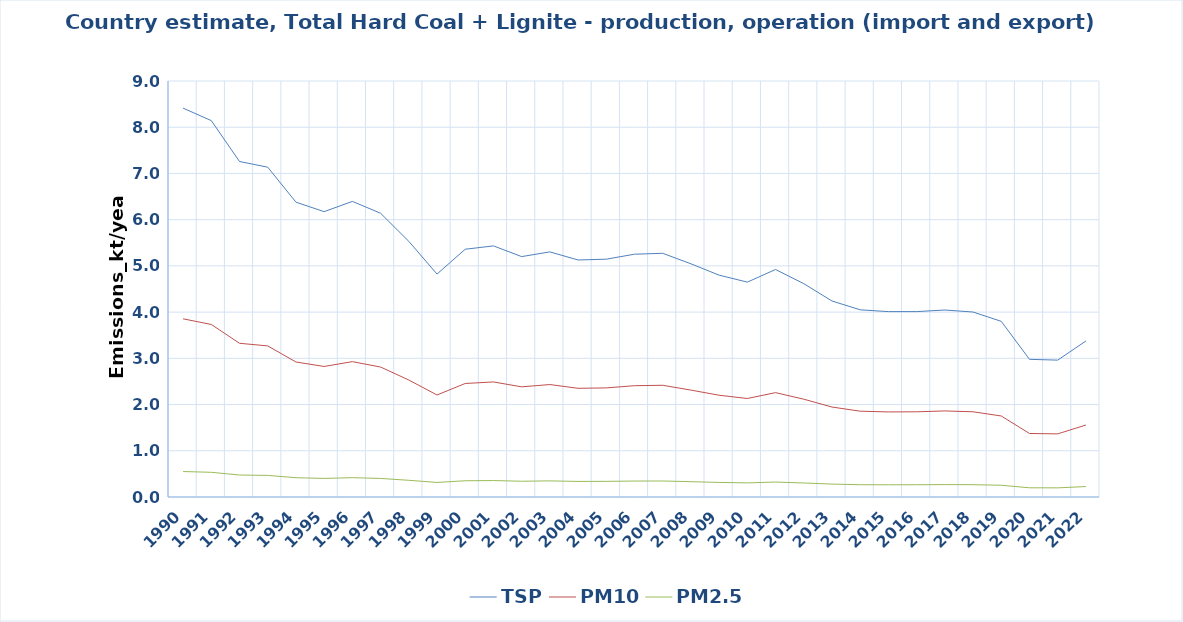
| Category | TSP | PM10 | PM2.5 |
|---|---|---|---|
| 1990 | 8.413 | 3.855 | 0.551 |
| 1991 | 8.143 | 3.732 | 0.534 |
| 1992 | 7.258 | 3.325 | 0.476 |
| 1993 | 7.135 | 3.269 | 0.467 |
| 1994 | 6.378 | 2.921 | 0.417 |
| 1995 | 6.174 | 2.824 | 0.402 |
| 1996 | 6.395 | 2.928 | 0.418 |
| 1997 | 6.139 | 2.812 | 0.402 |
| 1998 | 5.531 | 2.531 | 0.361 |
| 1999 | 4.823 | 2.207 | 0.315 |
| 2000 | 5.36 | 2.456 | 0.351 |
| 2001 | 5.433 | 2.489 | 0.356 |
| 2002 | 5.201 | 2.383 | 0.341 |
| 2003 | 5.303 | 2.433 | 0.349 |
| 2004 | 5.128 | 2.352 | 0.337 |
| 2005 | 5.145 | 2.36 | 0.338 |
| 2006 | 5.253 | 2.408 | 0.345 |
| 2007 | 5.272 | 2.417 | 0.346 |
| 2008 | 5.045 | 2.313 | 0.331 |
| 2009 | 4.799 | 2.201 | 0.316 |
| 2010 | 4.649 | 2.131 | 0.305 |
| 2011 | 4.922 | 2.258 | 0.324 |
| 2012 | 4.615 | 2.116 | 0.303 |
| 2013 | 4.24 | 1.946 | 0.279 |
| 2014 | 4.049 | 1.856 | 0.266 |
| 2015 | 4.011 | 1.841 | 0.264 |
| 2016 | 4.011 | 1.843 | 0.265 |
| 2017 | 4.046 | 1.862 | 0.269 |
| 2018 | 4.002 | 1.844 | 0.267 |
| 2019 | 3.8 | 1.752 | 0.254 |
| 2020 | 2.979 | 1.374 | 0.199 |
| 2021 | 2.961 | 1.366 | 0.198 |
| 2022 | 3.375 | 1.557 | 0.226 |